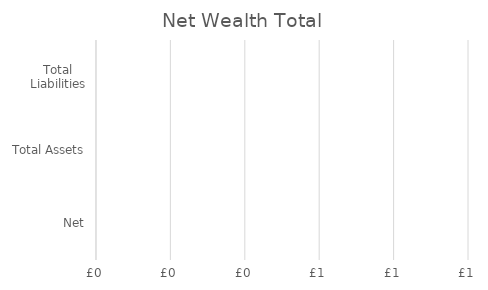
| Category | Net Wealth |
|---|---|
| Net | 0 |
| Total Assets | 0 |
| Total Liabilities | 0 |